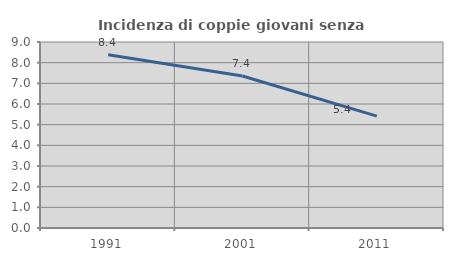
| Category | Incidenza di coppie giovani senza figli |
|---|---|
| 1991.0 | 8.378 |
| 2001.0 | 7.356 |
| 2011.0 | 5.416 |